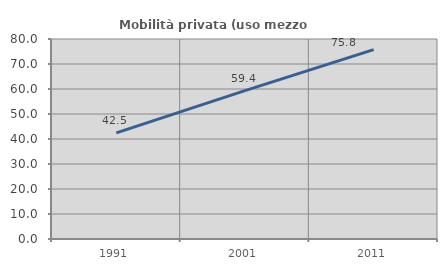
| Category | Mobilità privata (uso mezzo privato) |
|---|---|
| 1991.0 | 42.456 |
| 2001.0 | 59.36 |
| 2011.0 | 75.755 |